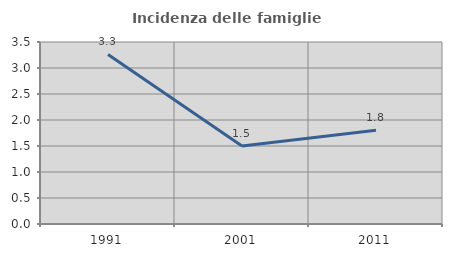
| Category | Incidenza delle famiglie numerose |
|---|---|
| 1991.0 | 3.261 |
| 2001.0 | 1.499 |
| 2011.0 | 1.802 |